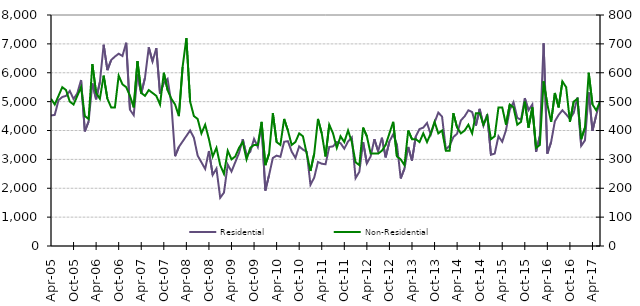
| Category | Residential |
|---|---|
| 2005-04-01 | 4520 |
| 2005-05-01 | 4540 |
| 2005-06-01 | 5050 |
| 2005-07-01 | 5160 |
| 2005-08-01 | 5200 |
| 2005-09-01 | 5370 |
| 2005-10-01 | 5090 |
| 2005-11-01 | 5290 |
| 2005-12-01 | 5750 |
| 2006-01-01 | 3970 |
| 2006-02-01 | 4310 |
| 2006-03-01 | 5630 |
| 2006-04-01 | 5080 |
| 2006-05-01 | 5680 |
| 2006-06-01 | 6970 |
| 2006-07-01 | 6090 |
| 2006-08-01 | 6440 |
| 2006-09-01 | 6560 |
| 2006-10-01 | 6660 |
| 2006-11-01 | 6580 |
| 2006-12-01 | 7040 |
| 2007-01-01 | 4720 |
| 2007-02-01 | 4530 |
| 2007-03-01 | 5940 |
| 2007-04-01 | 5280 |
| 2007-05-01 | 5830 |
| 2007-06-01 | 6880 |
| 2007-07-01 | 6390 |
| 2007-08-01 | 6850 |
| 2007-09-01 | 5270 |
| 2007-10-01 | 5660 |
| 2007-11-01 | 5790 |
| 2007-12-01 | 4940 |
| 2008-01-01 | 3110 |
| 2008-02-01 | 3430 |
| 2008-03-01 | 3620 |
| 2008-04-01 | 3810 |
| 2008-05-01 | 4000 |
| 2008-06-01 | 3750 |
| 2008-07-01 | 3130 |
| 2008-08-01 | 2900 |
| 2008-09-01 | 2670 |
| 2008-10-01 | 3290 |
| 2008-11-01 | 2460 |
| 2008-12-01 | 2680 |
| 2009-01-01 | 1670 |
| 2009-02-01 | 1850 |
| 2009-03-01 | 2820 |
| 2009-04-01 | 2580 |
| 2009-05-01 | 2900 |
| 2009-06-01 | 3220 |
| 2009-07-01 | 3700 |
| 2009-08-01 | 3130 |
| 2009-09-01 | 3270 |
| 2009-10-01 | 3710 |
| 2009-11-01 | 3430 |
| 2009-12-01 | 4210 |
| 2010-01-01 | 1920 |
| 2010-02-01 | 2460 |
| 2010-03-01 | 3050 |
| 2010-04-01 | 3130 |
| 2010-05-01 | 3090 |
| 2010-06-01 | 3610 |
| 2010-07-01 | 3630 |
| 2010-08-01 | 3270 |
| 2010-09-01 | 3050 |
| 2010-10-01 | 3450 |
| 2010-11-01 | 3340 |
| 2010-12-01 | 3260 |
| 2011-01-01 | 2120 |
| 2011-02-01 | 2370 |
| 2011-03-01 | 2910 |
| 2011-04-01 | 2850 |
| 2011-05-01 | 2830 |
| 2011-06-01 | 3430 |
| 2011-07-01 | 3450 |
| 2011-08-01 | 3600 |
| 2011-09-01 | 3560 |
| 2011-10-01 | 3370 |
| 2011-11-01 | 3620 |
| 2011-12-01 | 3760 |
| 2012-01-01 | 2350 |
| 2012-02-01 | 2570 |
| 2012-03-01 | 3600 |
| 2012-04-01 | 2860 |
| 2012-05-01 | 3100 |
| 2012-06-01 | 3700 |
| 2012-07-01 | 3280 |
| 2012-08-01 | 3750 |
| 2012-09-01 | 3070 |
| 2012-10-01 | 3620 |
| 2012-11-01 | 3870 |
| 2012-12-01 | 3510 |
| 2013-01-01 | 2340 |
| 2013-02-01 | 2680 |
| 2013-03-01 | 3430 |
| 2013-04-01 | 2960 |
| 2013-05-01 | 3790 |
| 2013-06-01 | 4050 |
| 2013-07-01 | 4100 |
| 2013-08-01 | 4260 |
| 2013-09-01 | 3860 |
| 2013-10-01 | 4280 |
| 2013-11-01 | 4620 |
| 2013-12-01 | 4480 |
| 2014-01-01 | 3350 |
| 2014-02-01 | 3470 |
| 2014-03-01 | 3770 |
| 2014-04-01 | 3890 |
| 2014-05-01 | 4350 |
| 2014-06-01 | 4490 |
| 2014-07-01 | 4700 |
| 2014-08-01 | 4640 |
| 2014-09-01 | 4170 |
| 2014-10-01 | 4750 |
| 2014-11-01 | 4170 |
| 2014-12-01 | 4560 |
| 2015-01-01 | 3160 |
| 2015-02-01 | 3200 |
| 2015-03-01 | 3800 |
| 2015-04-01 | 3610 |
| 2015-05-01 | 4010 |
| 2015-06-01 | 4720 |
| 2015-07-01 | 4980 |
| 2015-08-01 | 4440 |
| 2015-09-01 | 4370 |
| 2015-10-01 | 5120 |
| 2015-11-01 | 4700 |
| 2015-12-01 | 4900 |
| 2016-01-01 | 3260 |
| 2016-02-01 | 3810 |
| 2016-03-01 | 7020 |
| 2016-04-01 | 3200 |
| 2016-05-01 | 3600 |
| 2016-06-01 | 4320 |
| 2016-07-01 | 4540 |
| 2016-08-01 | 4700 |
| 2016-09-01 | 4560 |
| 2016-10-01 | 4400 |
| 2016-11-01 | 4610 |
| 2016-12-01 | 5140 |
| 2017-01-01 | 3470 |
| 2017-02-01 | 3660 |
| 2017-03-01 | 5320 |
| 2017-04-01 | 3990 |
| 2017-05-01 | 4530 |
| 2017-06-01 | 5020 |